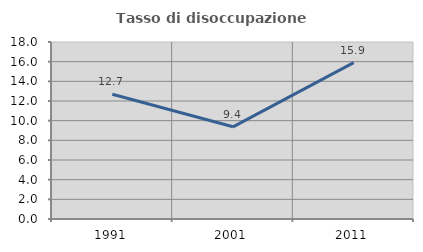
| Category | Tasso di disoccupazione giovanile  |
|---|---|
| 1991.0 | 12.687 |
| 2001.0 | 9.375 |
| 2011.0 | 15.909 |